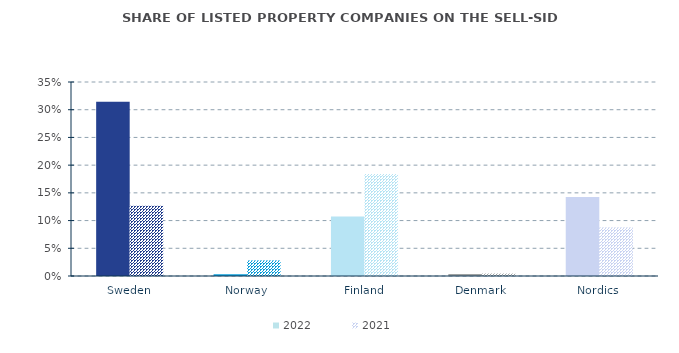
| Category | 2022 | 2021 |
|---|---|---|
| Sweden | 0.314 | 0.127 |
| Norway | 0.003 | 0.028 |
| Finland | 0.107 | 0.184 |
| Denmark | 0.004 | 0.005 |
| Nordics | 0.143 | 0.087 |